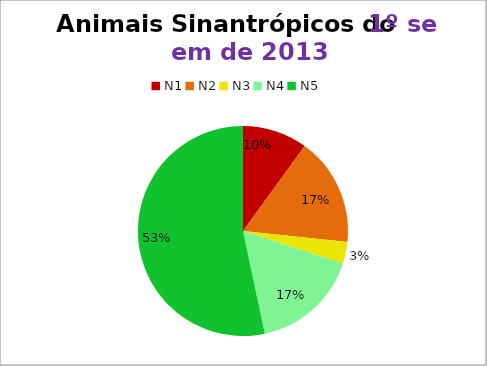
| Category | 1º/13 |
|---|---|
| N1 | 3 |
| N2 | 5 |
| N3 | 1 |
| N4 | 5 |
| N5 | 16 |